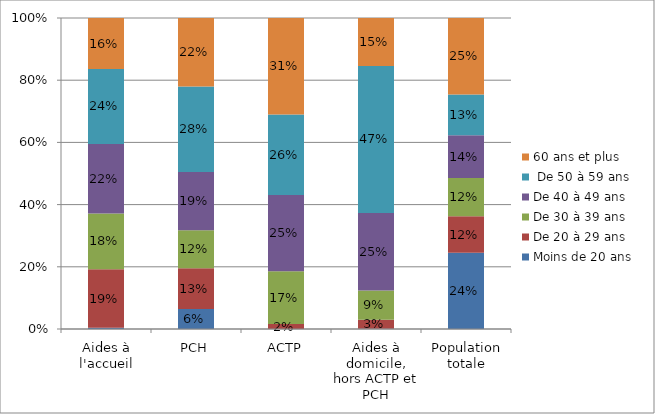
| Category | Moins de 20 ans  | De 20 à 29 ans | De 30 à 39 ans | De 40 à 49 ans |  De 50 à 59 ans | 60 ans et plus |
|---|---|---|---|---|---|---|
| Aides à l'accueil | 0.004 | 0.188 | 0.179 | 0.224 | 0.241 | 0.164 |
| PCH | 0.064 | 0.131 | 0.122 | 0.187 | 0.275 | 0.22 |
| ACTP | 0 | 0.016 | 0.17 | 0.245 | 0.259 | 0.311 |
| Aides à domicile, hors ACTP et PCH | 0.001 | 0.029 | 0.094 | 0.249 | 0.472 | 0.154 |
| Population totale | 0.245 | 0.117 | 0.123 | 0.137 | 0.131 | 0.246 |